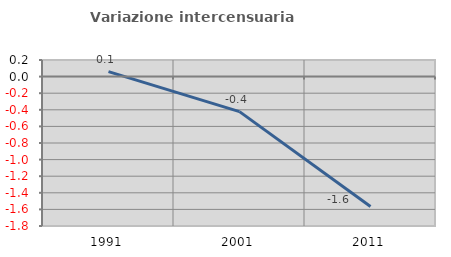
| Category | Variazione intercensuaria annua |
|---|---|
| 1991.0 | 0.059 |
| 2001.0 | -0.422 |
| 2011.0 | -1.565 |